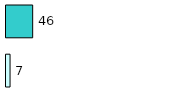
| Category | Series 0 | Series 1 |
|---|---|---|
| 0 | 7 | 46 |